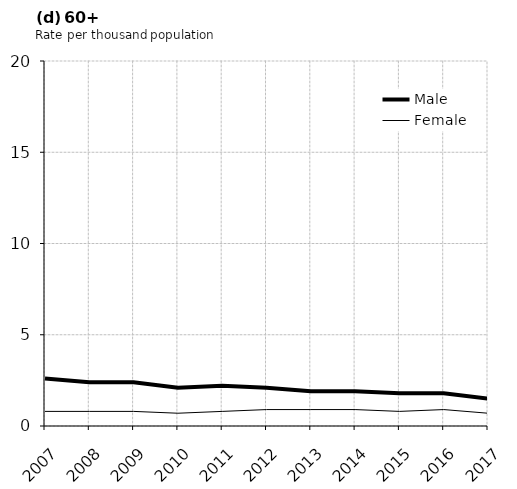
| Category | Male | Female |
|---|---|---|
| 2007.0 | 2.6 | 0.8 |
| 2008.0 | 2.4 | 0.8 |
| 2009.0 | 2.4 | 0.8 |
| 2010.0 | 2.1 | 0.7 |
| 2011.0 | 2.2 | 0.8 |
| 2012.0 | 2.1 | 0.9 |
| 2013.0 | 1.9 | 0.9 |
| 2014.0 | 1.9 | 0.9 |
| 2015.0 | 1.8 | 0.8 |
| 2016.0 | 1.8 | 0.9 |
| 2017.0 | 1.5 | 0.7 |